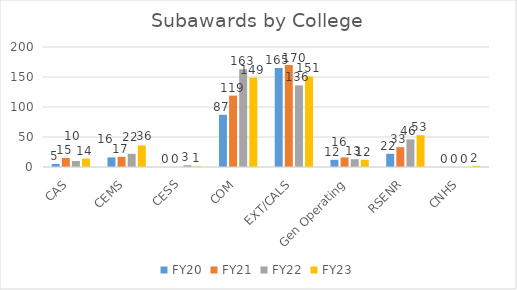
| Category | FY20 | FY21 | FY22 | FY23 |
|---|---|---|---|---|
| CAS | 5 | 15 | 10 | 14 |
| CEMS | 16 | 17 | 22 | 36 |
| CESS | 0 | 0 | 3 | 1 |
| COM | 87 | 119 | 163 | 149 |
| EXT/CALS | 165 | 170 | 136 | 151 |
| Gen Operating | 12 | 16 | 13 | 12 |
| RSENR | 22 | 33 | 46 | 53 |
| CNHS | 0 | 0 | 0 | 2 |